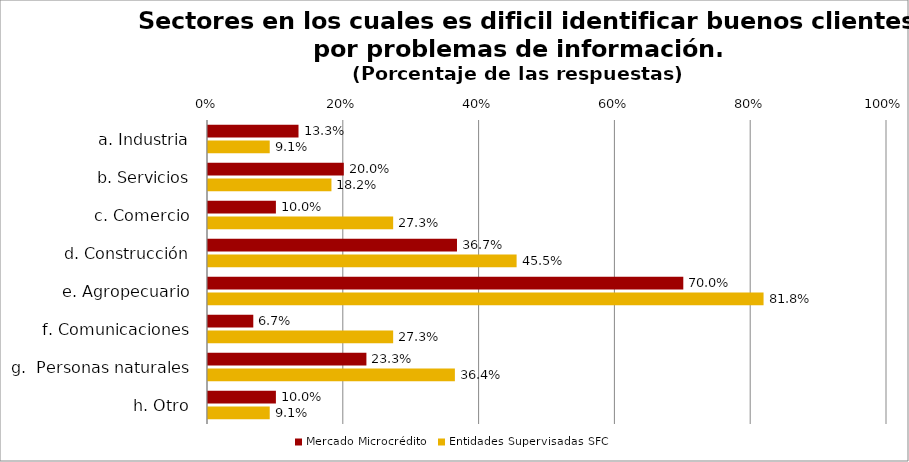
| Category | Mercado Microcrédito | Entidades Supervisadas SFC |
|---|---|---|
| a. Industria | 0.133 | 0.091 |
| b. Servicios | 0.2 | 0.182 |
| c. Comercio | 0.1 | 0.273 |
| d. Construcción | 0.367 | 0.454 |
| e. Agropecuario | 0.7 | 0.818 |
| f. Comunicaciones | 0.067 | 0.273 |
| g.  Personas naturales | 0.233 | 0.364 |
| h. Otro | 0.1 | 0.091 |